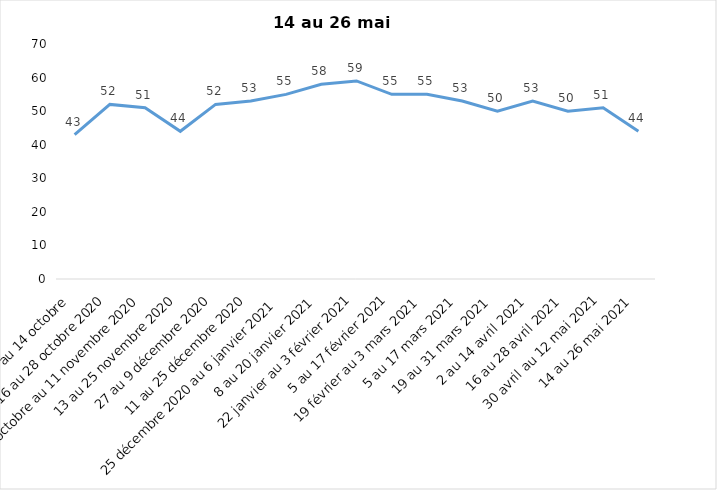
| Category | Toujours aux trois mesures |
|---|---|
| 2 au 14 octobre  | 43 |
| 16 au 28 octobre 2020 | 52 |
| 30 octobre au 11 novembre 2020 | 51 |
| 13 au 25 novembre 2020 | 44 |
| 27 au 9 décembre 2020 | 52 |
| 11 au 25 décembre 2020 | 53 |
| 25 décembre 2020 au 6 janvier 2021 | 55 |
| 8 au 20 janvier 2021 | 58 |
| 22 janvier au 3 février 2021 | 59 |
| 5 au 17 février 2021 | 55 |
| 19 février au 3 mars 2021 | 55 |
| 5 au 17 mars 2021 | 53 |
| 19 au 31 mars 2021 | 50 |
| 2 au 14 avril 2021 | 53 |
| 16 au 28 avril 2021 | 50 |
| 30 avril au 12 mai 2021 | 51 |
| 14 au 26 mai 2021 | 44 |